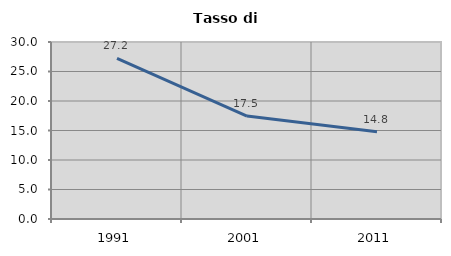
| Category | Tasso di disoccupazione   |
|---|---|
| 1991.0 | 27.211 |
| 2001.0 | 17.456 |
| 2011.0 | 14.806 |